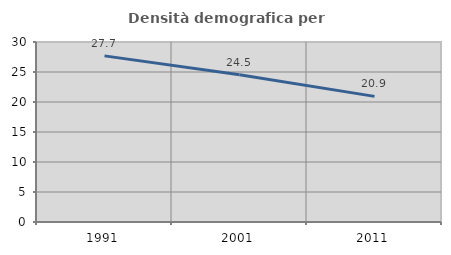
| Category | Densità demografica |
|---|---|
| 1991.0 | 27.69 |
| 2001.0 | 24.538 |
| 2011.0 | 20.936 |